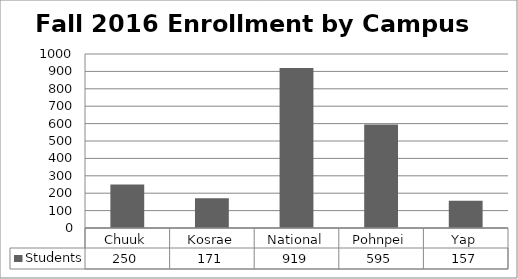
| Category | Students |
|---|---|
| Chuuk | 250 |
| Kosrae | 171 |
| National | 919 |
| Pohnpei | 595 |
| Yap | 157 |